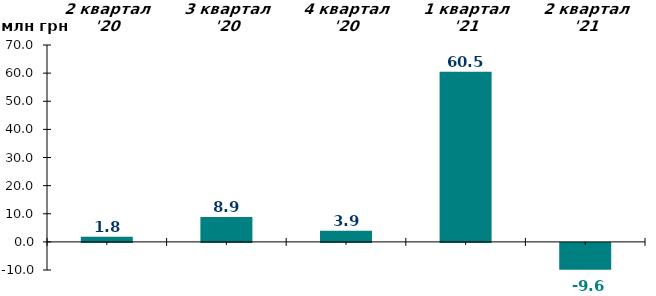
| Category | Чистий притік/відтік за відповідний квартал, млн грн |
|---|---|
| 2 квартал '20 | 1.78 |
| 3 квартал '20 | 8.85 |
| 4 квартал '20 | 3.93 |
| 1 квартал '21 | 60.53 |
| 2 квартал '21 | -9.56 |